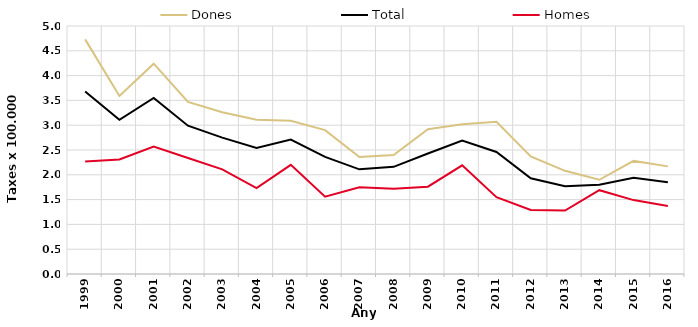
| Category | Dones | Total | Homes |
|---|---|---|---|
| 1999.0 | 4.73 | 3.68 | 2.27 |
| 2000.0 | 3.59 | 3.11 | 2.31 |
| 2001.0 | 4.24 | 3.55 | 2.57 |
| 2002.0 | 3.47 | 2.99 | 2.34 |
| 2003.0 | 3.26 | 2.75 | 2.11 |
| 2004.0 | 3.11 | 2.54 | 1.73 |
| 2005.0 | 3.09 | 2.71 | 2.2 |
| 2006.0 | 2.9 | 2.36 | 1.56 |
| 2007.0 | 2.36 | 2.11 | 1.75 |
| 2008.0 | 2.4 | 2.16 | 1.72 |
| 2009.0 | 2.92 | 2.43 | 1.76 |
| 2010.0 | 3.02 | 2.69 | 2.19 |
| 2011.0 | 3.07 | 2.46 | 1.55 |
| 2012.0 | 2.37 | 1.93 | 1.29 |
| 2013.0 | 2.08 | 1.77 | 1.28 |
| 2014.0 | 1.9 | 1.8 | 1.69 |
| 2015.0 | 2.28 | 1.94 | 1.49 |
| 2016.0 | 2.17 | 1.85 | 1.37 |